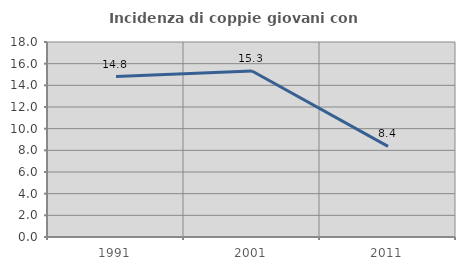
| Category | Incidenza di coppie giovani con figli |
|---|---|
| 1991.0 | 14.815 |
| 2001.0 | 15.326 |
| 2011.0 | 8.36 |